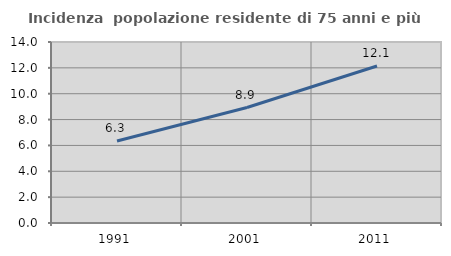
| Category | Incidenza  popolazione residente di 75 anni e più |
|---|---|
| 1991.0 | 6.337 |
| 2001.0 | 8.93 |
| 2011.0 | 12.141 |